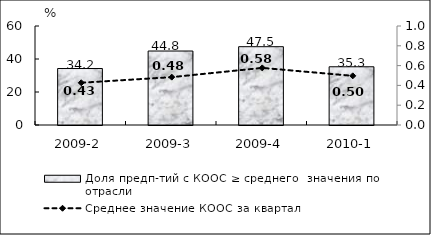
| Category | Доля предп-тий с КООС ≥ среднего  значения по отрасли |
|---|---|
| 2009-2 | 34.23 |
| 2009-3 | 44.83 |
| 2009-4 | 47.46 |
| 2010-1 | 35.29 |